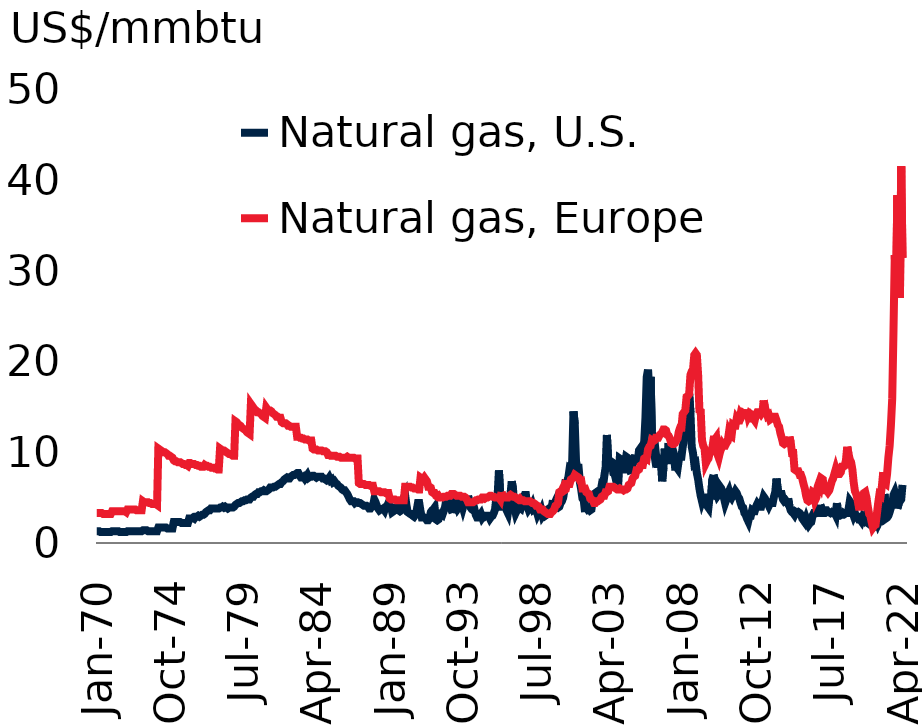
| Category | Natural gas, U.S. | Natural gas, Europe |
|---|---|---|
| 1970-01-01 | 1.3 | 3.3 |
| 1970-02-01 | 1.3 | 3.3 |
| 1970-03-01 | 1.3 | 3.3 |
| 1970-04-01 | 1.2 | 3.3 |
| 1970-05-01 | 1.2 | 3.3 |
| 1970-06-01 | 1.2 | 3.2 |
| 1970-07-01 | 1.2 | 3.2 |
| 1970-08-01 | 1.2 | 3.2 |
| 1970-09-01 | 1.2 | 3.2 |
| 1970-10-01 | 1.2 | 3.2 |
| 1970-11-01 | 1.2 | 3.2 |
| 1970-12-01 | 1.2 | 3.2 |
| 1971-01-01 | 1.3 | 3.5 |
| 1971-02-01 | 1.3 | 3.5 |
| 1971-03-01 | 1.3 | 3.5 |
| 1971-04-01 | 1.3 | 3.5 |
| 1971-05-01 | 1.3 | 3.5 |
| 1971-06-01 | 1.3 | 3.5 |
| 1971-07-01 | 1.2 | 3.5 |
| 1971-08-01 | 1.2 | 3.5 |
| 1971-09-01 | 1.2 | 3.5 |
| 1971-10-01 | 1.2 | 3.5 |
| 1971-11-01 | 1.2 | 3.5 |
| 1971-12-01 | 1.2 | 3.4 |
| 1972-01-01 | 1.3 | 3.7 |
| 1972-02-01 | 1.3 | 3.7 |
| 1972-03-01 | 1.3 | 3.7 |
| 1972-04-01 | 1.3 | 3.7 |
| 1972-05-01 | 1.3 | 3.7 |
| 1972-06-01 | 1.3 | 3.7 |
| 1972-07-01 | 1.3 | 3.7 |
| 1972-08-01 | 1.3 | 3.6 |
| 1972-09-01 | 1.3 | 3.6 |
| 1972-10-01 | 1.3 | 3.6 |
| 1972-11-01 | 1.3 | 3.6 |
| 1972-12-01 | 1.3 | 3.6 |
| 1973-01-01 | 1.4 | 4.6 |
| 1973-02-01 | 1.4 | 4.5 |
| 1973-03-01 | 1.4 | 4.5 |
| 1973-04-01 | 1.4 | 4.5 |
| 1973-05-01 | 1.3 | 4.5 |
| 1973-06-01 | 1.3 | 4.4 |
| 1973-07-01 | 1.3 | 4.4 |
| 1973-08-01 | 1.3 | 4.3 |
| 1973-09-01 | 1.3 | 4.3 |
| 1973-10-01 | 1.3 | 4.3 |
| 1973-11-01 | 1.3 | 4.3 |
| 1973-12-01 | 1.3 | 4.2 |
| 1974-01-01 | 1.7 | 10.4 |
| 1974-02-01 | 1.7 | 10.3 |
| 1974-03-01 | 1.7 | 10.2 |
| 1974-04-01 | 1.7 | 10.1 |
| 1974-05-01 | 1.7 | 10 |
| 1974-06-01 | 1.7 | 10 |
| 1974-07-01 | 1.7 | 9.9 |
| 1974-08-01 | 1.6 | 9.8 |
| 1974-09-01 | 1.6 | 9.6 |
| 1974-10-01 | 1.6 | 9.6 |
| 1974-11-01 | 1.6 | 9.5 |
| 1974-12-01 | 1.6 | 9.4 |
| 1975-01-01 | 2.3 | 9.1 |
| 1975-02-01 | 2.3 | 9 |
| 1975-03-01 | 2.3 | 9 |
| 1975-04-01 | 2.3 | 8.9 |
| 1975-05-01 | 2.3 | 8.9 |
| 1975-06-01 | 2.3 | 8.9 |
| 1975-07-01 | 2.2 | 8.8 |
| 1975-08-01 | 2.2 | 8.7 |
| 1975-09-01 | 2.2 | 8.7 |
| 1975-10-01 | 2.2 | 8.6 |
| 1975-11-01 | 2.2 | 8.6 |
| 1975-12-01 | 2.2 | 8.5 |
| 1976-01-01 | 2.7 | 8.8 |
| 1976-02-01 | 2.7 | 8.8 |
| 1976-03-01 | 2.7 | 8.7 |
| 1976-04-01 | 2.8 | 8.7 |
| 1976-05-01 | 2.7 | 8.7 |
| 1976-06-01 | 2.9 | 8.6 |
| 1976-07-01 | 2.9 | 8.6 |
| 1976-08-01 | 3 | 8.5 |
| 1976-09-01 | 2.9 | 8.5 |
| 1976-10-01 | 3 | 8.4 |
| 1976-11-01 | 3.1 | 8.4 |
| 1976-12-01 | 3.1 | 8.4 |
| 1977-01-01 | 3.2 | 8.6 |
| 1977-02-01 | 3.4 | 8.5 |
| 1977-03-01 | 3.5 | 8.5 |
| 1977-04-01 | 3.6 | 8.4 |
| 1977-05-01 | 3.6 | 8.4 |
| 1977-06-01 | 3.8 | 8.3 |
| 1977-07-01 | 3.8 | 8.3 |
| 1977-08-01 | 3.8 | 8.3 |
| 1977-09-01 | 3.8 | 8.2 |
| 1977-10-01 | 3.8 | 8.2 |
| 1977-11-01 | 3.8 | 8.1 |
| 1977-12-01 | 3.8 | 8.1 |
| 1978-01-01 | 3.9 | 10.4 |
| 1978-02-01 | 3.9 | 10.3 |
| 1978-03-01 | 4 | 10.2 |
| 1978-04-01 | 3.9 | 10.2 |
| 1978-05-01 | 4 | 10.1 |
| 1978-06-01 | 3.9 | 10 |
| 1978-07-01 | 3.8 | 9.9 |
| 1978-08-01 | 3.9 | 9.8 |
| 1978-09-01 | 3.9 | 9.8 |
| 1978-10-01 | 3.9 | 9.7 |
| 1978-11-01 | 3.9 | 9.6 |
| 1978-12-01 | 4 | 9.6 |
| 1979-01-01 | 4.2 | 13.4 |
| 1979-02-01 | 4.3 | 13.3 |
| 1979-03-01 | 4.4 | 13.1 |
| 1979-04-01 | 4.4 | 13 |
| 1979-05-01 | 4.5 | 12.9 |
| 1979-06-01 | 4.6 | 12.7 |
| 1979-07-01 | 4.6 | 12.6 |
| 1979-08-01 | 4.7 | 12.5 |
| 1979-09-01 | 4.7 | 12.4 |
| 1979-10-01 | 4.8 | 12.2 |
| 1979-11-01 | 4.8 | 12.1 |
| 1979-12-01 | 4.8 | 12 |
| 1980-01-01 | 5 | 15.3 |
| 1980-02-01 | 5.1 | 15.1 |
| 1980-03-01 | 5.1 | 14.9 |
| 1980-04-01 | 5.3 | 14.7 |
| 1980-05-01 | 5.4 | 14.6 |
| 1980-06-01 | 5.4 | 14.4 |
| 1980-07-01 | 5.6 | 14.4 |
| 1980-08-01 | 5.6 | 14.3 |
| 1980-09-01 | 5.7 | 14.2 |
| 1980-10-01 | 5.7 | 14 |
| 1980-11-01 | 5.8 | 13.9 |
| 1980-12-01 | 5.7 | 13.8 |
| 1981-01-01 | 5.7 | 14.9 |
| 1981-02-01 | 5.8 | 14.7 |
| 1981-03-01 | 5.9 | 14.6 |
| 1981-04-01 | 6.1 | 14.6 |
| 1981-05-01 | 6.1 | 14.5 |
| 1981-06-01 | 6.1 | 14.3 |
| 1981-07-01 | 6.2 | 14.2 |
| 1981-08-01 | 6.2 | 14.1 |
| 1981-09-01 | 6.3 | 13.9 |
| 1981-10-01 | 6.4 | 13.9 |
| 1981-11-01 | 6.5 | 13.8 |
| 1981-12-01 | 6.5 | 13.8 |
| 1982-01-01 | 6.7 | 13.3 |
| 1982-02-01 | 6.8 | 13.2 |
| 1982-03-01 | 7 | 13.2 |
| 1982-04-01 | 7.1 | 13.2 |
| 1982-05-01 | 7.2 | 13.1 |
| 1982-06-01 | 7.1 | 12.9 |
| 1982-07-01 | 7.1 | 12.9 |
| 1982-08-01 | 7.3 | 12.8 |
| 1982-09-01 | 7.4 | 12.8 |
| 1982-10-01 | 7.5 | 12.8 |
| 1982-11-01 | 7.5 | 12.8 |
| 1982-12-01 | 7.6 | 12.8 |
| 1983-01-01 | 7.7 | 11.7 |
| 1983-02-01 | 7.7 | 11.7 |
| 1983-03-01 | 7.4 | 11.6 |
| 1983-04-01 | 7.2 | 11.6 |
| 1983-05-01 | 7.2 | 11.5 |
| 1983-06-01 | 7.3 | 11.5 |
| 1983-07-01 | 7.1 | 11.4 |
| 1983-08-01 | 7.3 | 11.4 |
| 1983-09-01 | 7.5 | 11.4 |
| 1983-10-01 | 7.2 | 11.3 |
| 1983-11-01 | 7.3 | 11.3 |
| 1983-12-01 | 7.3 | 11.3 |
| 1984-01-01 | 7.4 | 10.4 |
| 1984-02-01 | 7.4 | 10.3 |
| 1984-03-01 | 7.3 | 10.3 |
| 1984-04-01 | 7.2 | 10.3 |
| 1984-05-01 | 7.3 | 10.2 |
| 1984-06-01 | 7.3 | 10.2 |
| 1984-07-01 | 7.3 | 10.2 |
| 1984-08-01 | 7.3 | 10.2 |
| 1984-09-01 | 7.1 | 10.1 |
| 1984-10-01 | 7.1 | 10.1 |
| 1984-11-01 | 7 | 10.1 |
| 1984-12-01 | 6.9 | 10 |
| 1985-01-01 | 7 | 9.7 |
| 1985-02-01 | 7.2 | 9.7 |
| 1985-03-01 | 6.9 | 9.6 |
| 1985-04-01 | 7 | 9.6 |
| 1985-05-01 | 6.7 | 9.6 |
| 1985-06-01 | 6.8 | 9.6 |
| 1985-07-01 | 6.6 | 9.6 |
| 1985-08-01 | 6.5 | 9.5 |
| 1985-09-01 | 6.3 | 9.5 |
| 1985-10-01 | 6.2 | 9.5 |
| 1985-11-01 | 6.1 | 9.4 |
| 1985-12-01 | 5.9 | 9.4 |
| 1986-01-01 | 5.8 | 9.4 |
| 1986-02-01 | 5.8 | 9.4 |
| 1986-03-01 | 5.6 | 9.4 |
| 1986-04-01 | 5.4 | 9.5 |
| 1986-05-01 | 5.1 | 9.4 |
| 1986-06-01 | 4.8 | 9.4 |
| 1986-07-01 | 4.6 | 9.4 |
| 1986-08-01 | 4.6 | 9.4 |
| 1986-09-01 | 4.6 | 9.4 |
| 1986-10-01 | 4.4 | 9.3 |
| 1986-11-01 | 4.5 | 9.3 |
| 1986-12-01 | 4.5 | 9.3 |
| 1987-01-01 | 4.4 | 6.6 |
| 1987-02-01 | 4.4 | 6.5 |
| 1987-03-01 | 4.3 | 6.5 |
| 1987-04-01 | 4.2 | 6.5 |
| 1987-05-01 | 4.1 | 6.5 |
| 1987-06-01 | 4.1 | 6.4 |
| 1987-07-01 | 4.1 | 6.4 |
| 1987-08-01 | 4 | 6.4 |
| 1987-09-01 | 3.8 | 6.4 |
| 1987-10-01 | 3.8 | 6.3 |
| 1987-11-01 | 4 | 6.3 |
| 1987-12-01 | 4.1 | 6.3 |
| 1988-01-01 | 4.8 | 5.7 |
| 1988-02-01 | 4.5 | 5.7 |
| 1988-03-01 | 4.1 | 5.7 |
| 1988-04-01 | 3.8 | 5.7 |
| 1988-05-01 | 3.6 | 5.7 |
| 1988-06-01 | 3.7 | 5.6 |
| 1988-07-01 | 3.7 | 5.6 |
| 1988-08-01 | 3.8 | 5.6 |
| 1988-09-01 | 3.6 | 5.6 |
| 1988-10-01 | 4 | 5.5 |
| 1988-11-01 | 4.1 | 5.5 |
| 1988-12-01 | 4.4 | 5.5 |
| 1989-01-01 | 4.1 | 4.9 |
| 1989-02-01 | 4 | 4.8 |
| 1989-03-01 | 3.4 | 4.8 |
| 1989-04-01 | 3.5 | 4.8 |
| 1989-05-01 | 3.8 | 4.8 |
| 1989-06-01 | 3.9 | 4.7 |
| 1989-07-01 | 3.7 | 4.7 |
| 1989-08-01 | 3.6 | 4.7 |
| 1989-09-01 | 3.5 | 4.7 |
| 1989-10-01 | 3.6 | 4.7 |
| 1989-11-01 | 4.3 | 4.7 |
| 1989-12-01 | 5 | 4.7 |
| 1990-01-01 | 5.3 | 6.2 |
| 1990-02-01 | 4.2 | 6.2 |
| 1990-03-01 | 3.4 | 6.2 |
| 1990-04-01 | 3.3 | 6.2 |
| 1990-05-01 | 3.2 | 6.2 |
| 1990-06-01 | 3.2 | 6.1 |
| 1990-07-01 | 3 | 6.1 |
| 1990-08-01 | 2.9 | 6 |
| 1990-09-01 | 3.1 | 6 |
| 1990-10-01 | 3.6 | 6 |
| 1990-11-01 | 4.4 | 5.9 |
| 1990-12-01 | 4.4 | 5.9 |
| 1991-01-01 | 3.5 | 7.2 |
| 1991-02-01 | 2.8 | 7.1 |
| 1991-03-01 | 2.8 | 7 |
| 1991-04-01 | 2.8 | 7.2 |
| 1991-05-01 | 2.7 | 7 |
| 1991-06-01 | 2.5 | 6.8 |
| 1991-07-01 | 2.5 | 6.2 |
| 1991-08-01 | 2.7 | 6.2 |
| 1991-09-01 | 3.4 | 6.1 |
| 1991-10-01 | 3.6 | 5.6 |
| 1991-11-01 | 3.7 | 5.5 |
| 1991-12-01 | 3.9 | 5.5 |
| 1992-01-01 | 2.6 | 5.2 |
| 1992-02-01 | 2.5 | 5.1 |
| 1992-03-01 | 2.6 | 5.2 |
| 1992-04-01 | 3 | 5 |
| 1992-05-01 | 3.2 | 5 |
| 1992-06-01 | 3.1 | 5 |
| 1992-07-01 | 3.5 | 5.1 |
| 1992-08-01 | 3.9 | 5.1 |
| 1992-09-01 | 4.7 | 5.1 |
| 1992-10-01 | 4.8 | 5.2 |
| 1992-11-01 | 4.4 | 5.2 |
| 1992-12-01 | 4.3 | 5.2 |
| 1993-01-01 | 3.7 | 5.4 |
| 1993-02-01 | 3.3 | 5.4 |
| 1993-03-01 | 4.3 | 5.4 |
| 1993-04-01 | 4.6 | 5.3 |
| 1993-05-01 | 4.2 | 5.2 |
| 1993-06-01 | 3.8 | 5.2 |
| 1993-07-01 | 4 | 5.2 |
| 1993-08-01 | 4.4 | 5.2 |
| 1993-09-01 | 4.4 | 5.1 |
| 1993-10-01 | 3.9 | 5.1 |
| 1993-11-01 | 4.4 | 5.1 |
| 1993-12-01 | 4.5 | 5 |
| 1994-01-01 | 4.5 | 4.8 |
| 1994-02-01 | 5.2 | 4.5 |
| 1994-03-01 | 4.2 | 4.5 |
| 1994-04-01 | 3.9 | 4.5 |
| 1994-05-01 | 3.7 | 4.5 |
| 1994-06-01 | 3.6 | 4.5 |
| 1994-07-01 | 3.7 | 4.6 |
| 1994-08-01 | 3.1 | 4.7 |
| 1994-09-01 | 2.8 | 4.7 |
| 1994-10-01 | 2.8 | 4.8 |
| 1994-11-01 | 3 | 4.8 |
| 1994-12-01 | 3.2 | 4.8 |
| 1995-01-01 | 2.8 | 5 |
| 1995-02-01 | 3 | 5 |
| 1995-03-01 | 2.9 | 4.9 |
| 1995-04-01 | 3 | 5 |
| 1995-05-01 | 3 | 5 |
| 1995-06-01 | 3 | 5.1 |
| 1995-07-01 | 2.7 | 5.2 |
| 1995-08-01 | 2.9 | 5.2 |
| 1995-09-01 | 3 | 5.1 |
| 1995-10-01 | 3.3 | 5.1 |
| 1995-11-01 | 3.7 | 5 |
| 1995-12-01 | 5 | 5 |
| 1996-01-01 | 5.3 | 5 |
| 1996-02-01 | 8 | 5 |
| 1996-03-01 | 5.3 | 4.8 |
| 1996-04-01 | 4 | 5.6 |
| 1996-05-01 | 4 | 5.1 |
| 1996-06-01 | 4.5 | 5.1 |
| 1996-07-01 | 4.5 | 5 |
| 1996-08-01 | 3.6 | 5 |
| 1996-09-01 | 3.3 | 5 |
| 1996-10-01 | 4.2 | 5.2 |
| 1996-11-01 | 5.4 | 5.3 |
| 1996-12-01 | 6.8 | 5.2 |
| 1997-01-01 | 5.9 | 5.1 |
| 1997-02-01 | 3.9 | 5.1 |
| 1997-03-01 | 3.3 | 5 |
| 1997-04-01 | 3.6 | 4.9 |
| 1997-05-01 | 3.9 | 4.8 |
| 1997-06-01 | 3.9 | 4.9 |
| 1997-07-01 | 3.8 | 4.7 |
| 1997-08-01 | 4.3 | 4.7 |
| 1997-09-01 | 5 | 4.7 |
| 1997-10-01 | 5.3 | 4.6 |
| 1997-11-01 | 5.3 | 4.6 |
| 1997-12-01 | 4.1 | 4.6 |
| 1998-01-01 | 3.7 | 4.6 |
| 1998-02-01 | 3.9 | 4.6 |
| 1998-03-01 | 3.9 | 4.5 |
| 1998-04-01 | 4.2 | 4.4 |
| 1998-05-01 | 3.7 | 4.4 |
| 1998-06-01 | 3.8 | 4.3 |
| 1998-07-01 | 3.7 | 4.1 |
| 1998-08-01 | 3.2 | 4.1 |
| 1998-09-01 | 3.5 | 4 |
| 1998-10-01 | 3.3 | 3.7 |
| 1998-11-01 | 3.6 | 3.7 |
| 1998-12-01 | 3 | 3.7 |
| 1999-01-01 | 3.2 | 3.5 |
| 1999-02-01 | 3 | 3.4 |
| 1999-03-01 | 3.1 | 3.3 |
| 1999-04-01 | 3.7 | 3.2 |
| 1999-05-01 | 3.8 | 3.2 |
| 1999-06-01 | 3.9 | 3.2 |
| 1999-07-01 | 3.9 | 3.4 |
| 1999-08-01 | 4.7 | 3.5 |
| 1999-09-01 | 4.3 | 3.7 |
| 1999-10-01 | 4.6 | 4.1 |
| 1999-11-01 | 4 | 4.2 |
| 1999-12-01 | 3.9 | 4.4 |
| 2000-01-01 | 4 | 5.6 |
| 2000-02-01 | 4.4 | 5.7 |
| 2000-03-01 | 4.6 | 5.8 |
| 2000-04-01 | 5 | 6.1 |
| 2000-05-01 | 5.9 | 5.8 |
| 2000-06-01 | 7 | 5.9 |
| 2000-07-01 | 6.5 | 6.5 |
| 2000-08-01 | 7.2 | 6.5 |
| 2000-09-01 | 8.2 | 6.5 |
| 2000-10-01 | 8.1 | 7 |
| 2000-11-01 | 9 | 7.1 |
| 2000-12-01 | 14.5 | 7.2 |
| 2001-01-01 | 13.1 | 7.5 |
| 2001-02-01 | 9 | 7.4 |
| 2001-03-01 | 8.3 | 7.3 |
| 2001-04-01 | 8.3 | 7.2 |
| 2001-05-01 | 6.7 | 6.9 |
| 2001-06-01 | 5.9 | 6.9 |
| 2001-07-01 | 4.9 | 6 |
| 2001-08-01 | 4.7 | 6 |
| 2001-09-01 | 3.4 | 6 |
| 2001-10-01 | 3.9 | 5.6 |
| 2001-11-01 | 3.7 | 5.5 |
| 2001-12-01 | 3.8 | 5.4 |
| 2002-01-01 | 3.6 | 4.9 |
| 2002-02-01 | 3.7 | 4.8 |
| 2002-03-01 | 4.8 | 4.7 |
| 2002-04-01 | 5.4 | 4.4 |
| 2002-05-01 | 5.5 | 4.4 |
| 2002-06-01 | 5.1 | 4.6 |
| 2002-07-01 | 4.7 | 4.6 |
| 2002-08-01 | 4.8 | 4.7 |
| 2002-09-01 | 5.6 | 4.8 |
| 2002-10-01 | 6.4 | 5.1 |
| 2002-11-01 | 6.3 | 5.2 |
| 2002-12-01 | 7.4 | 5.2 |
| 2003-01-01 | 8.3 | 5.6 |
| 2003-02-01 | 11.9 | 5.6 |
| 2003-03-01 | 9.1 | 5.7 |
| 2003-04-01 | 8.1 | 6.2 |
| 2003-05-01 | 9 | 6.2 |
| 2003-06-01 | 8.9 | 6.2 |
| 2003-07-01 | 7.7 | 6.2 |
| 2003-08-01 | 7.6 | 6.1 |
| 2003-09-01 | 7 | 6 |
| 2003-10-01 | 7.1 | 5.9 |
| 2003-11-01 | 6.9 | 5.9 |
| 2003-12-01 | 9.3 | 6 |
| 2004-01-01 | 9.2 | 5.9 |
| 2004-02-01 | 8.1 | 5.9 |
| 2004-03-01 | 8.1 | 5.8 |
| 2004-04-01 | 8.6 | 5.9 |
| 2004-05-01 | 9.5 | 5.9 |
| 2004-06-01 | 9.4 | 6 |
| 2004-07-01 | 8.8 | 6.4 |
| 2004-08-01 | 8 | 6.5 |
| 2004-09-01 | 7.6 | 6.6 |
| 2004-10-01 | 9.5 | 7.1 |
| 2004-11-01 | 9 | 7.3 |
| 2004-12-01 | 9.7 | 7.4 |
| 2005-01-01 | 9.1 | 8 |
| 2005-02-01 | 9 | 8 |
| 2005-03-01 | 10.2 | 8.1 |
| 2005-04-01 | 10.4 | 8.5 |
| 2005-05-01 | 9.4 | 8.6 |
| 2005-06-01 | 10.5 | 8.6 |
| 2005-07-01 | 11 | 9.3 |
| 2005-08-01 | 13.8 | 9.4 |
| 2005-09-01 | 18.3 | 9.3 |
| 2005-10-01 | 19.1 | 10.3 |
| 2005-11-01 | 14.8 | 10.6 |
| 2005-12-01 | 18.3 | 10.7 |
| 2006-01-01 | 12.3 | 11.3 |
| 2006-02-01 | 10.6 | 11.2 |
| 2006-03-01 | 9.7 | 11.3 |
| 2006-04-01 | 10 | 11.6 |
| 2006-05-01 | 8.7 | 11.6 |
| 2006-06-01 | 8.7 | 11.6 |
| 2006-07-01 | 8.7 | 11.9 |
| 2006-08-01 | 9.7 | 12 |
| 2006-09-01 | 6.8 | 12.2 |
| 2006-10-01 | 8.3 | 12.5 |
| 2006-11-01 | 10.4 | 12.5 |
| 2006-12-01 | 9.1 | 12.4 |
| 2007-01-01 | 9.1 | 11.9 |
| 2007-02-01 | 11 | 11.8 |
| 2007-03-01 | 9.8 | 11.5 |
| 2007-04-01 | 10.4 | 11 |
| 2007-05-01 | 10.4 | 10.9 |
| 2007-06-01 | 9.9 | 10.9 |
| 2007-07-01 | 8.4 | 11 |
| 2007-08-01 | 8.4 | 11.3 |
| 2007-09-01 | 8.2 | 11.5 |
| 2007-10-01 | 9.2 | 12.3 |
| 2007-11-01 | 9.5 | 12.7 |
| 2007-12-01 | 9.5 | 12.7 |
| 2008-01-01 | 10.6 | 14.2 |
| 2008-02-01 | 11.3 | 14.4 |
| 2008-03-01 | 12.4 | 14.6 |
| 2008-04-01 | 13.4 | 16.1 |
| 2008-05-01 | 14.7 | 16.2 |
| 2008-06-01 | 16.4 | 16.4 |
| 2008-07-01 | 14.4 | 18.5 |
| 2008-08-01 | 10.6 | 18.9 |
| 2008-09-01 | 9.9 | 19.1 |
| 2008-10-01 | 8.7 | 20.7 |
| 2008-11-01 | 8.8 | 20.9 |
| 2008-12-01 | 7.7 | 20.7 |
| 2009-01-01 | 7 | 18.5 |
| 2009-02-01 | 6 | 14.6 |
| 2009-03-01 | 5.2 | 14.5 |
| 2009-04-01 | 4.6 | 11.3 |
| 2009-05-01 | 5 | 10.7 |
| 2009-06-01 | 5 | 10.4 |
| 2009-07-01 | 4.5 | 8.8 |
| 2009-08-01 | 4.1 | 9.1 |
| 2009-09-01 | 3.9 | 9.3 |
| 2009-10-01 | 5.2 | 9.9 |
| 2009-11-01 | 4.8 | 10.1 |
| 2009-12-01 | 7 | 10.4 |
| 2010-01-01 | 7.5 | 11.4 |
| 2010-02-01 | 6.9 | 11.4 |
| 2010-03-01 | 5.6 | 11.6 |
| 2010-04-01 | 5.2 | 9.8 |
| 2010-05-01 | 5.4 | 9.4 |
| 2010-06-01 | 6.2 | 10 |
| 2010-07-01 | 6 | 10.4 |
| 2010-08-01 | 5.6 | 10.9 |
| 2010-09-01 | 5 | 10.7 |
| 2010-10-01 | 4.4 | 10.7 |
| 2010-11-01 | 4.8 | 11 |
| 2010-12-01 | 5.4 | 11.2 |
| 2011-01-01 | 5.7 | 12.2 |
| 2011-02-01 | 5.2 | 11.9 |
| 2011-03-01 | 5 | 11.8 |
| 2011-04-01 | 5.3 | 13 |
| 2011-05-01 | 5.4 | 12.9 |
| 2011-06-01 | 5.7 | 12.9 |
| 2011-07-01 | 5.5 | 13.7 |
| 2011-08-01 | 5.1 | 13.5 |
| 2011-09-01 | 4.9 | 13.5 |
| 2011-10-01 | 4.4 | 14.2 |
| 2011-11-01 | 4 | 14 |
| 2011-12-01 | 3.9 | 14.3 |
| 2012-01-01 | 3.3 | 14.2 |
| 2012-02-01 | 3.1 | 13.7 |
| 2012-03-01 | 2.7 | 14.7 |
| 2012-04-01 | 2.4 | 14 |
| 2012-05-01 | 3 | 14.3 |
| 2012-06-01 | 3 | 14.2 |
| 2012-07-01 | 3.6 | 13.7 |
| 2012-08-01 | 3.5 | 13.7 |
| 2012-09-01 | 3.5 | 13.5 |
| 2012-10-01 | 4 | 14.1 |
| 2012-11-01 | 4.3 | 14.4 |
| 2012-12-01 | 4.1 | 14.4 |
| 2013-01-01 | 4 | 14.4 |
| 2013-02-01 | 4 | 14.2 |
| 2013-03-01 | 4.6 | 14.4 |
| 2013-04-01 | 5.1 | 15.7 |
| 2013-05-01 | 4.9 | 14.9 |
| 2013-06-01 | 4.6 | 14.5 |
| 2013-07-01 | 4.4 | 14 |
| 2013-08-01 | 4.1 | 14.1 |
| 2013-09-01 | 4.4 | 13.6 |
| 2013-10-01 | 4.4 | 13.7 |
| 2013-11-01 | 4.4 | 13.8 |
| 2013-12-01 | 5.1 | 13.9 |
| 2014-01-01 | 5.6 | 13.9 |
| 2014-02-01 | 7.1 | 13.5 |
| 2014-03-01 | 5.8 | 13 |
| 2014-04-01 | 5.5 | 12.8 |
| 2014-05-01 | 5.4 | 12.1 |
| 2014-06-01 | 5.4 | 11.6 |
| 2014-07-01 | 4.8 | 11 |
| 2014-08-01 | 4.6 | 10.9 |
| 2014-09-01 | 4.7 | 11 |
| 2014-10-01 | 4.5 | 11.6 |
| 2014-11-01 | 4.9 | 10.6 |
| 2014-12-01 | 4.1 | 11.7 |
| 2015-01-01 | 3.6 | 11.1 |
| 2015-02-01 | 3.4 | 9.9 |
| 2015-03-01 | 3.3 | 9.9 |
| 2015-04-01 | 3.1 | 8.1 |
| 2015-05-01 | 3.4 | 8 |
| 2015-06-01 | 3.3 | 7.9 |
| 2015-07-01 | 3.4 | 7.9 |
| 2015-08-01 | 3.3 | 7.5 |
| 2015-09-01 | 3.1 | 7.5 |
| 2015-10-01 | 2.7 | 7.1 |
| 2015-11-01 | 2.5 | 6.5 |
| 2015-12-01 | 2.3 | 6 |
| 2016-01-01 | 2.7 | 5.2 |
| 2016-02-01 | 2.3 | 4.7 |
| 2016-03-01 | 2 | 4.6 |
| 2016-04-01 | 2.2 | 4.7 |
| 2016-05-01 | 2.3 | 5.1 |
| 2016-06-01 | 3 | 5.6 |
| 2016-07-01 | 3.3 | 5.5 |
| 2016-08-01 | 3.3 | 4.7 |
| 2016-09-01 | 3.5 | 5 |
| 2016-10-01 | 3.4 | 6.2 |
| 2016-11-01 | 2.9 | 6.6 |
| 2016-12-01 | 4.2 | 6.3 |
| 2017-01-01 | 3.8 | 7.1 |
| 2017-02-01 | 3.3 | 7 |
| 2017-03-01 | 3.3 | 5.8 |
| 2017-04-01 | 3.6 | 5.8 |
| 2017-05-01 | 3.6 | 5.8 |
| 2017-06-01 | 3.4 | 5.6 |
| 2017-07-01 | 3.4 | 5.8 |
| 2017-08-01 | 3.3 | 6.3 |
| 2017-09-01 | 3.4 | 6.8 |
| 2017-10-01 | 3.3 | 7.1 |
| 2017-11-01 | 3.4 | 7.6 |
| 2017-12-01 | 3.1 | 8.1 |
| 2018-01-01 | 4.4 | 7.6 |
| 2018-02-01 | 3 | 7.6 |
| 2018-03-01 | 3 | 7.6 |
| 2018-04-01 | 3.1 | 7.8 |
| 2018-05-01 | 3.1 | 8.4 |
| 2018-06-01 | 3.3 | 8.4 |
| 2018-07-01 | 3.2 | 8.5 |
| 2018-08-01 | 3.3 | 9.1 |
| 2018-09-01 | 3.3 | 10.6 |
| 2018-10-01 | 3.7 | 9.8 |
| 2018-11-01 | 4.6 | 9.2 |
| 2018-12-01 | 4.4 | 8.9 |
| 2019-01-01 | 3.4 | 8.1 |
| 2019-02-01 | 3 | 6.7 |
| 2019-03-01 | 3.3 | 5.7 |
| 2019-04-01 | 2.9 | 5.4 |
| 2019-05-01 | 2.9 | 4.8 |
| 2019-06-01 | 2.6 | 4 |
| 2019-07-01 | 2.6 | 4 |
| 2019-08-01 | 2.4 | 4 |
| 2019-09-01 | 2.8 | 4.6 |
| 2019-10-01 | 2.6 | 5.5 |
| 2019-11-01 | 2.9 | 5.6 |
| 2019-12-01 | 2.4 | 5 |
| 2020-01-01 | 2.2 | 4 |
| 2020-02-01 | 2.1 | 3.2 |
| 2020-03-01 | 2 | 3 |
| 2020-04-01 | 1.9 | 2.3 |
| 2020-05-01 | 1.9 | 1.7 |
| 2020-06-01 | 1.8 | 1.9 |
| 2020-07-01 | 1.9 | 2 |
| 2020-08-01 | 2.5 | 3.1 |
| 2020-09-01 | 2.1 | 4.3 |
| 2020-10-01 | 2.4 | 5.3 |
| 2020-11-01 | 2.8 | 5.2 |
| 2020-12-01 | 2.7 | 6.3 |
| 2021-01-01 | 2.9 | 7.8 |
| 2021-02-01 | 5.4 | 6.6 |
| 2021-03-01 | 2.7 | 6.5 |
| 2021-04-01 | 2.8 | 7.6 |
| 2021-05-01 | 3 | 9.4 |
| 2021-06-01 | 3.4 | 10.7 |
| 2021-07-01 | 3.9 | 13 |
| 2021-08-01 | 4.2 | 15.9 |
| 2021-09-01 | 5.3 | 23.5 |
| 2021-10-01 | 5.6 | 31.7 |
| 2021-11-01 | 5.1 | 28 |
| 2021-12-01 | 3.8 | 38.3 |
| 2022-01-01 | 4.3 | 28.3 |
| 2022-02-01 | 4.6 | 27 |
| 2022-03-01 | 4.8 | 41.5 |
| 2022-04-01 | 6.4 | 31.4 |